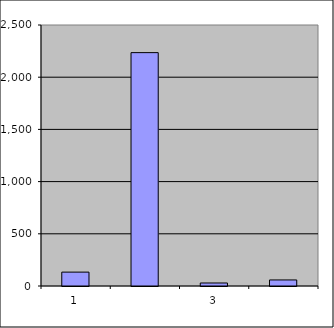
| Category | Series 0 |
|---|---|
| 0 | 133 |
| 1 | 2235.305 |
| 2 | 28.76 |
| 3 | 58.016 |